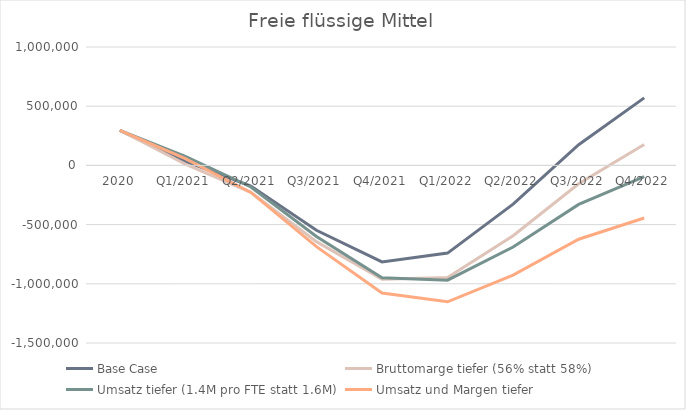
| Category | Base Case | Bruttomarge tiefer (56% statt 58%) | Umsatz tiefer (1.4M pro FTE statt 1.6M) | Umsatz und Margen tiefer |
|---|---|---|---|---|
| 2020 | 296547 | 296547 | 296547 | 296547 |
| Q1/2021 | 34520.622 | 10759.025 | 76990.622 | 56795.692 |
| Q2/2021 | -174358.729 | -227316.16 | -181868.896 | -228265.215 |
| Q3/2021 | -547580.776 | -644185.429 | -600451.268 | -685911.476 |
| Q4/2021 | -815420.58 | -960876.621 | -949289.214 | -1078411.922 |
| Q1/2022 | -740582.04 | -945890.513 | -969555.742 | -1152125.881 |
| Q2/2022 | -327676.021 | -593648.973 | -689159.538 | -925889.99 |
| Q3/2022 | 174671.442 | -155693.489 | -329366.024 | -623564.288 |
| Q4/2022 | 570139.936 | 177195.005 | -93929.657 | -443987.921 |